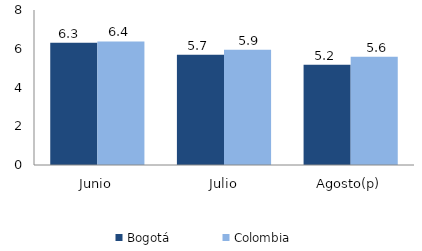
| Category | Bogotá | Colombia |
|---|---|---|
| Junio | 6.307 | 6.38 |
| Julio | 5.686 | 5.945 |
| Agosto(p) | 5.18 | 5.588 |